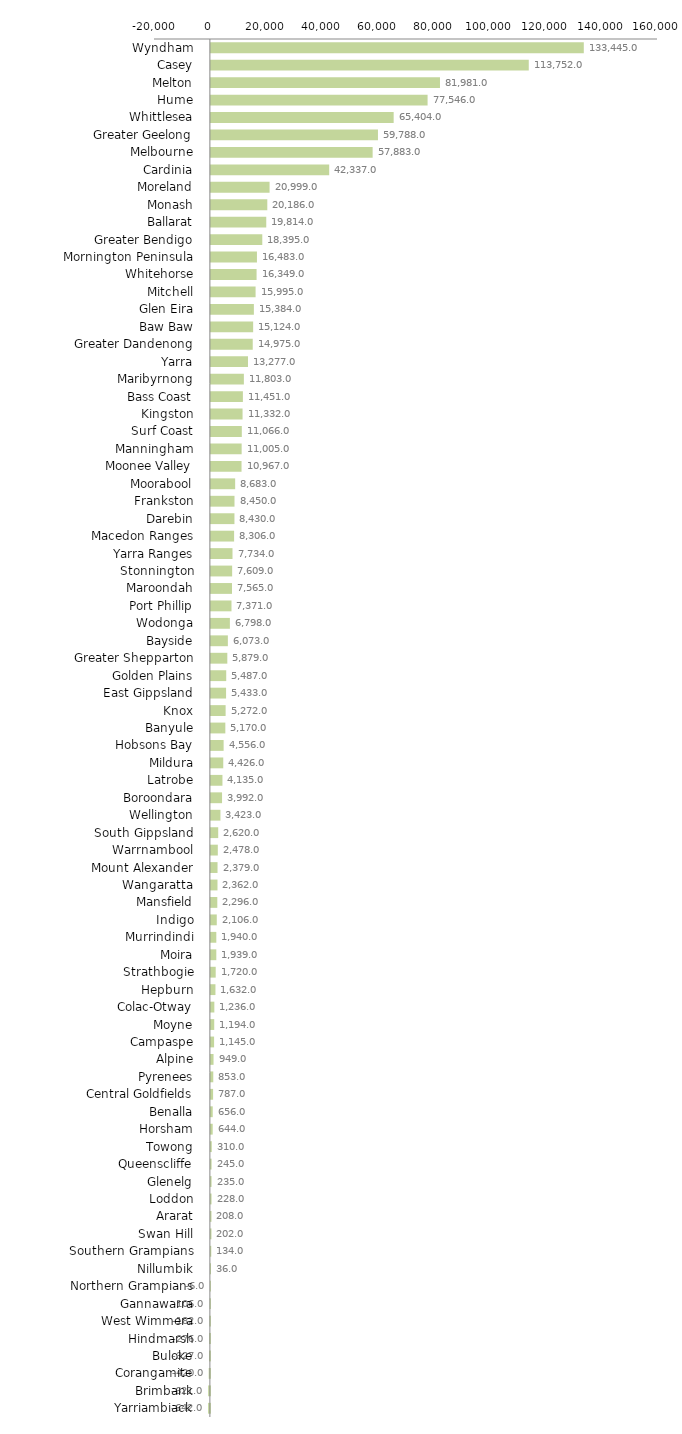
| Category | Series 0 |
|---|---|
| Wyndham  | 133445.008 |
| Casey  | 113752.001 |
| Melton  | 81981.004 |
| Hume  | 77546.003 |
| Whittlesea  | 65404.007 |
| Greater Geelong  | 59788.003 |
| Melbourne  | 57883.004 |
| Cardinia  | 42337.001 |
| Moreland  | 20999.005 |
| Monash  | 20186.005 |
| Ballarat  | 19814 |
| Greater Bendigo  | 18395.002 |
| Mornington Peninsula  | 16483.005 |
| Whitehorse  | 16349.007 |
| Mitchell  | 15995.005 |
| Glen Eira  | 15384.002 |
| Baw Baw  | 15124.001 |
| Greater Dandenong  | 14975.003 |
| Yarra  | 13277.008 |
| Maribyrnong  | 11803.004 |
| Bass Coast  | 11451 |
| Kingston  | 11332.004 |
| Surf Coast  | 11066.007 |
| Manningham  | 11005.004 |
| Moonee Valley  | 10967.005 |
| Moorabool  | 8683.005 |
| Frankston  | 8450.002 |
| Darebin  | 8430.002 |
| Macedon Ranges  | 8306.004 |
| Yarra Ranges  | 7734.008 |
| Stonnington  | 7609.006 |
| Maroondah  | 7565.004 |
| Port Phillip  | 7371.006 |
| Wodonga  | 6798.008 |
| Bayside  | 6073.001 |
| Greater Shepparton  | 5879.003 |
| Golden Plains  | 5487.002 |
| East Gippsland  | 5433.002 |
| Knox  | 5272.004 |
| Banyule  | 5170 |
| Hobsons Bay  | 4556.003 |
| Mildura  | 4426.005 |
| Latrobe  | 4135.004 |
| Boroondara  | 3992.001 |
| Wellington  | 3423.007 |
| South Gippsland  | 2620.006 |
| Warrnambool  | 2478.007 |
| Mount Alexander  | 2379.005 |
| Wangaratta  | 2362.007 |
| Mansfield  | 2296.004 |
| Indigo  | 2106.003 |
| Murrindindi  | 1940.006 |
| Moira  | 1939.005 |
| Strathbogie  | 1720.006 |
| Hepburn  | 1632.003 |
| Colac-Otway  | 1236.002 |
| Moyne  | 1194.006 |
| Campaspe  | 1145.001 |
| Alpine  | 949 |
| Pyrenees  | 853.006 |
| Central Goldfields  | 787.002 |
| Benalla  | 656.001 |
| Horsham  | 644.003 |
| Towong  | 310.007 |
| Queenscliffe  | 245.006 |
| Glenelg  | 235.002 |
| Loddon  | 228.004 |
| Ararat  | 208 |
| Swan Hill  | 202.007 |
| Southern Grampians  | 134.006 |
| Nillumbik  | 36.006 |
| Northern Grampians  | -5.994 |
| Gannawarra  | -105.998 |
| West Wimmera  | -181.993 |
| Hindmarsh  | -275.997 |
| Buloke  | -326.999 |
| Corangamite  | -419.998 |
| Brimbank  | -620.999 |
| Yarriambiack  | -641.992 |